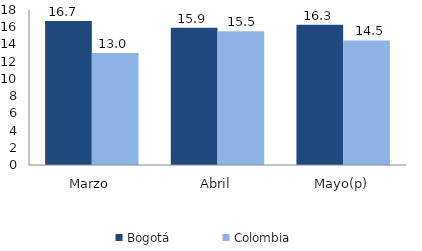
| Category | Bogotá | Colombia |
|---|---|---|
| Marzo | 16.718 | 13.002 |
| Abril | 15.929 | 15.54 |
| Mayo(p) | 16.277 | 14.467 |